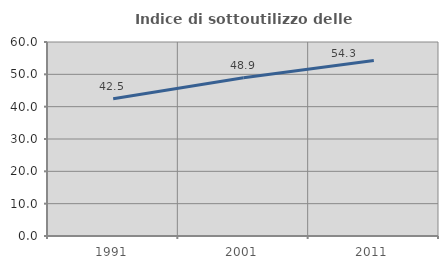
| Category | Indice di sottoutilizzo delle abitazioni  |
|---|---|
| 1991.0 | 42.459 |
| 2001.0 | 48.929 |
| 2011.0 | 54.258 |